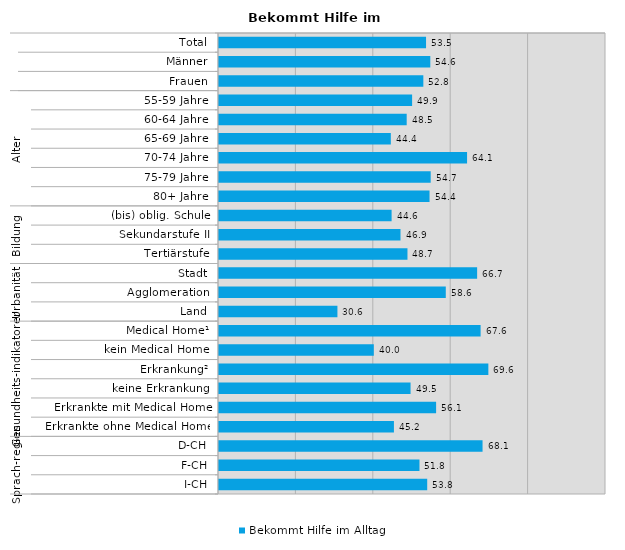
| Category | Bekommt Hilfe im Alltag |
|---|---|
| 0 | 53.5 |
| 1 | 54.6 |
| 2 | 52.8 |
| 3 | 49.9 |
| 4 | 48.5 |
| 5 | 44.4 |
| 6 | 64.1 |
| 7 | 54.7 |
| 8 | 54.4 |
| 9 | 44.6 |
| 10 | 46.9 |
| 11 | 48.7 |
| 12 | 66.7 |
| 13 | 58.6 |
| 14 | 30.6 |
| 15 | 67.6 |
| 16 | 40 |
| 17 | 69.6 |
| 18 | 49.5 |
| 19 | 56.1 |
| 20 | 45.2 |
| 21 | 68.1 |
| 22 | 51.8 |
| 23 | 53.8 |